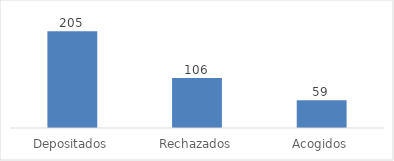
| Category | Series 0 |
|---|---|
| Depositados | 205 |
| Rechazados | 106 |
| Acogidos | 59 |